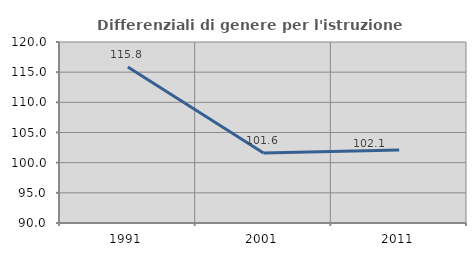
| Category | Differenziali di genere per l'istruzione superiore |
|---|---|
| 1991.0 | 115.849 |
| 2001.0 | 101.597 |
| 2011.0 | 102.085 |